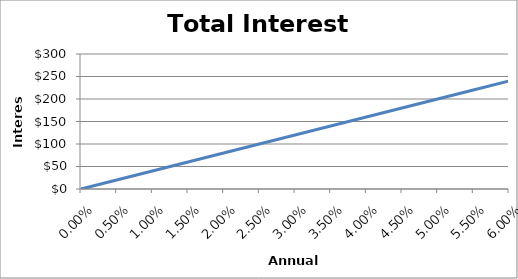
| Category | Series 0 |
|---|---|
| 0.0 | 0 |
| 0.005 | 20 |
| 0.01 | 40 |
| 0.015 | 60 |
| 0.02 | 80 |
| 0.025 | 100 |
| 0.03 | 120 |
| 0.035 | 140 |
| 0.04 | 160 |
| 0.045 | 180 |
| 0.05 | 200 |
| 0.055 | 220 |
| 0.06 | 240 |